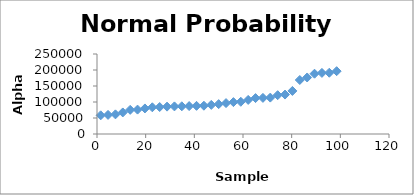
| Category | Series 0 |
|---|---|
| 1.5151515151515151 | 58356.1 |
| 4.545454545454545 | 59704 |
| 7.575757575757576 | 61388.6 |
| 10.606060606060606 | 67380.9 |
| 13.636363636363637 | 75493.9 |
| 16.666666666666668 | 76250 |
| 19.696969696969695 | 79857.5 |
| 22.727272727272727 | 83452.9 |
| 25.757575757575758 | 84231.8 |
| 28.78787878787879 | 85534.7 |
| 31.81818181818182 | 86242.2 |
| 34.84848484848485 | 86570 |
| 37.878787878787875 | 87284.2 |
| 40.90909090909091 | 87948.7 |
| 43.93939393939394 | 88400.3 |
| 46.96969696969697 | 90970.7 |
| 50.0 | 93335.5 |
| 53.03030303030303 | 96598.9 |
| 56.06060606060606 | 99658.21 |
| 59.09090909090909 | 100713.6 |
| 62.121212121212125 | 106531.1 |
| 65.15151515151514 | 112286.4 |
| 68.18181818181819 | 112854.8 |
| 71.21212121212122 | 113725.3 |
| 74.24242424242424 | 121289.1 |
| 77.27272727272727 | 123265 |
| 80.3030303030303 | 134572.5 |
| 83.33333333333333 | 168771.6 |
| 86.36363636363636 | 176649.1 |
| 89.39393939393939 | 188372.3 |
| 92.42424242424242 | 190964.4 |
| 95.45454545454545 | 191449.8 |
| 98.48484848484848 | 196354.6 |